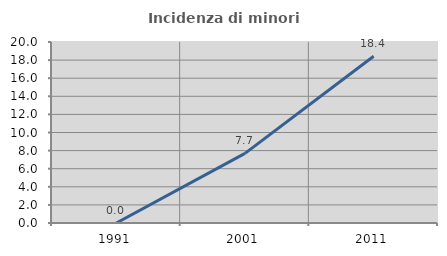
| Category | Incidenza di minori stranieri |
|---|---|
| 1991.0 | 0 |
| 2001.0 | 7.692 |
| 2011.0 | 18.421 |